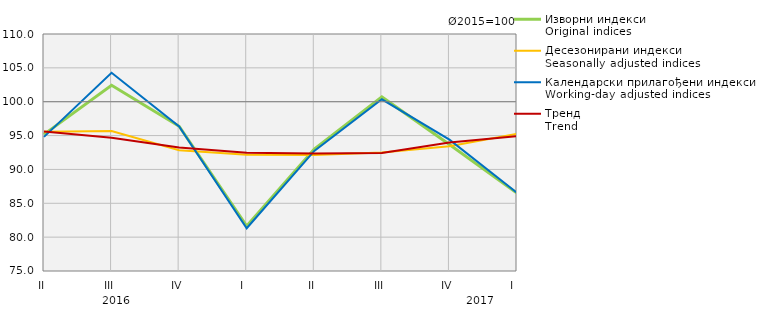
| Category | Изворни индекси
Original indices | Десезонирани индекси
Seasonally adjusted indices | Календарски прилагођени индекси
Working-day adjusted indices | Тренд
Trend |
|---|---|---|---|---|
| II | 95.175 | 95.569 | 94.809 | 95.591 |
| III | 102.434 | 95.685 | 104.265 | 94.676 |
| IV | 96.374 | 92.848 | 96.354 | 93.249 |
| I  | 81.644 | 92.165 | 81.311 | 92.454 |
| II | 93.009 | 92.116 | 92.732 | 92.37 |
| III | 100.703 | 92.51 | 100.361 | 92.422 |
| IV | 93.669 | 93.436 | 94.396 | 93.967 |
| I  | 86.484 | 95.263 | 86.56 | 94.904 |